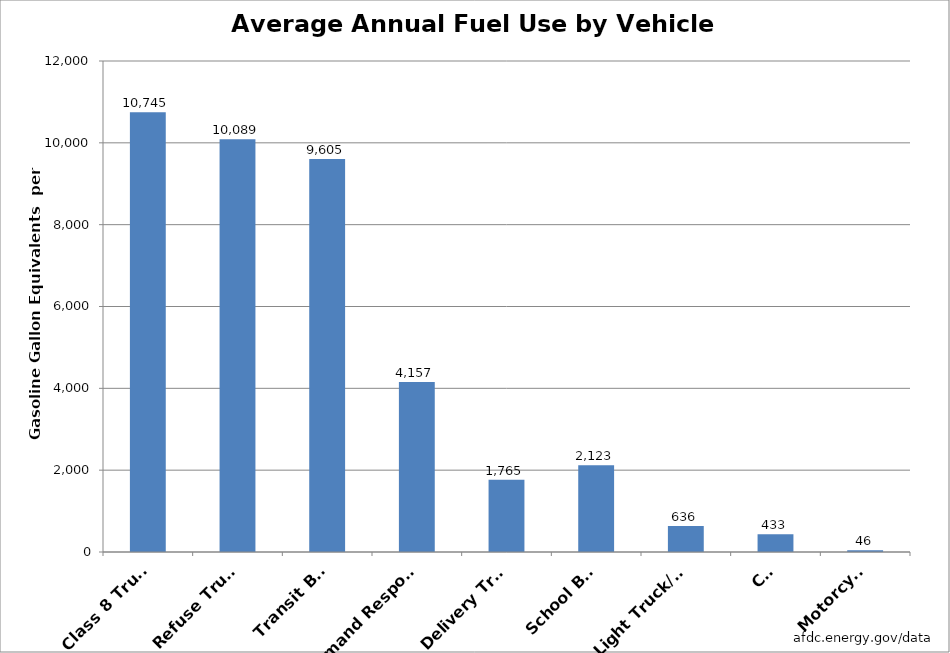
| Category | Series 0 |
|---|---|
| Class 8 Truck | 10745.472 |
| Refuse Truck | 10089 |
| Transit Bus | 9605.263 |
| Demand Response | 4157 |
| Delivery Truck | 1765.171 |
| School Bus | 2122.568 |
| Light Truck/Van | 635.843 |
| Car | 433.32 |
| Motorcycle | 45.568 |